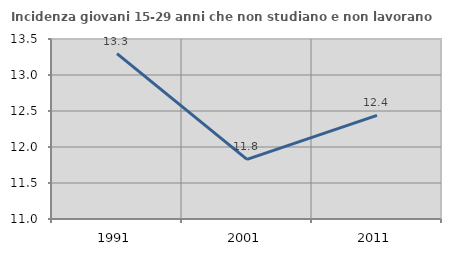
| Category | Incidenza giovani 15-29 anni che non studiano e non lavorano  |
|---|---|
| 1991.0 | 13.297 |
| 2001.0 | 11.827 |
| 2011.0 | 12.44 |